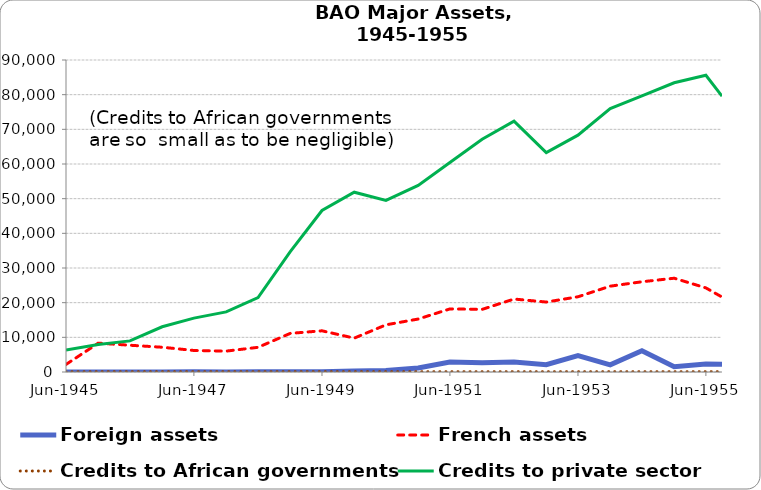
| Category | Foreign assets | French assets | Credits to African governments | Credits to private sector |
|---|---|---|---|---|
| 1945-06-30 | 21.161 | 2174.219 | 59.65 | 6350.959 |
| 1945-12-31 | 24.937 | 8322.337 | 83.905 | 7939.975 |
| 1946-06-30 | 11.324 | 7719.909 | 83.905 | 8975.562 |
| 1946-12-31 | 23.989 | 7141.347 | 83.905 | 13042.541 |
| 1947-06-30 | 64.637 | 6208.821 | 83.905 | 15539.433 |
| 1947-12-31 | 14.742 | 6021.705 | 83.905 | 17329.595 |
| 1948-06-30 | 77.936 | 7118.946 | 83.905 | 21440.099 |
| 1948-12-31 | 97.614 | 11141.458 | 94.3 | 34703.733 |
| 1949-06-30 | 57.388 | 11883.288 | 94.3 | 46590.968 |
| 1949-12-31 | 323.647 | 9768.867 | 94.3 | 51867.317 |
| 1950-06-30 | 439.415 | 13602.935 | 94.3 | 49507.509 |
| 1950-12-31 | 1176.388 | 15279.609 | 94.3 | 53841.341 |
| 1951-06-30 | 2849.018 | 18195.439 | 94.3 | 60446.312 |
| 1951-12-31 | 2663.739 | 18067.851 | 94.3 | 67148.188 |
| 1952-06-30 | 2875.403 | 21045.638 | 94.3 | 72370.33 |
| 1952-12-31 | 2123.821 | 20179.669 | 94.3 | 63292.658 |
| 1953-06-30 | 4762.106 | 21704.438 | 94.3 | 68325.492 |
| 1953-12-31 | 2077.689 | 24758.673 | 94.3 | 75958.896 |
| 1954-06-30 | 6155.101 | 26030.134 | 94.3 | 79642.535 |
| 1954-12-31 | 1515.351 | 27052.24 | 94.3 | 83423.238 |
| 1955-06-30 | 2293.547 | 24259.55 | 94.3 | 85588 |
| 1955-09-30 | 2252.845 | 21619.83 | 94.3 | 79560.215 |